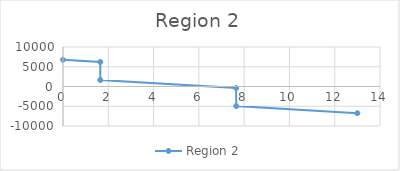
| Category | Region 2 |
|---|---|
| 0.0 | 6761.378 |
| 1.6458333333333335 | 6207.588 |
| 1.6458333333333335 | 1633.33 |
| 7.645833333333334 | -385.55 |
| 7.65 | -4961.21 |
| 13.0 | -6761.378 |